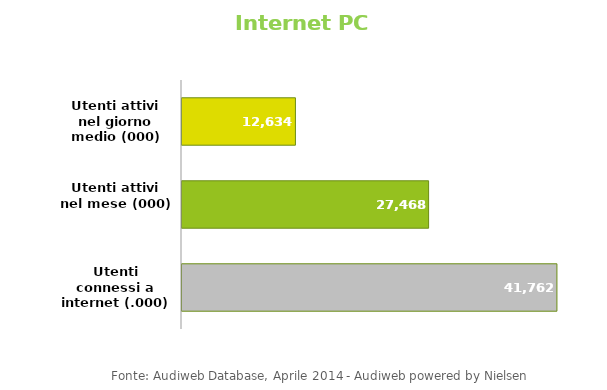
| Category | Apr-14 |
|---|---|
| Utenti connessi a internet (.000) | 41762 |
| Utenti attivi nel mese (000) | 27468 |
| Utenti attivi nel giorno medio (000) | 12634 |